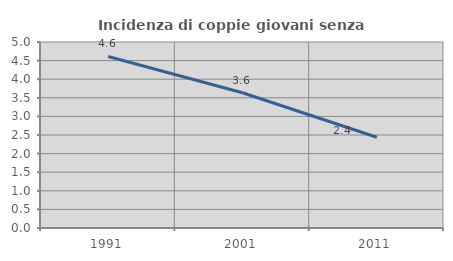
| Category | Incidenza di coppie giovani senza figli |
|---|---|
| 1991.0 | 4.611 |
| 2001.0 | 3.636 |
| 2011.0 | 2.439 |